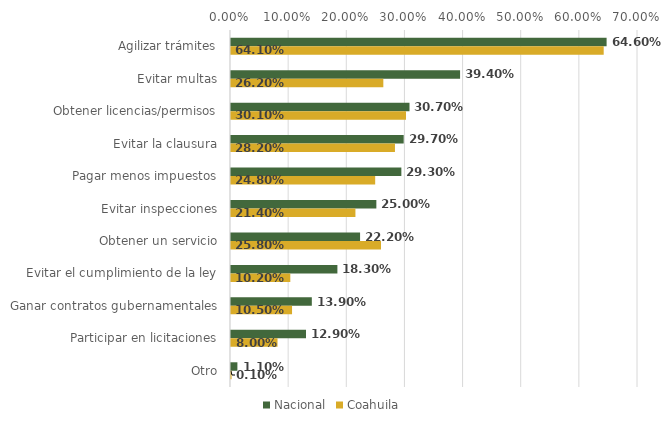
| Category | Nacional | Coahuila |
|---|---|---|
| Agilizar trámites | 0.646 | 0.641 |
| Evitar multas | 0.394 | 0.262 |
| Obtener licencias/permisos | 0.307 | 0.301 |
| Evitar la clausura | 0.297 | 0.282 |
| Pagar menos impuestos | 0.293 | 0.248 |
| Evitar inspecciones | 0.25 | 0.214 |
| Obtener un servicio | 0.222 | 0.258 |
| Evitar el cumplimiento de la ley | 0.183 | 0.102 |
| Ganar contratos gubernamentales | 0.139 | 0.105 |
| Participar en licitaciones | 0.129 | 0.08 |
| Otro | 0.011 | 0.001 |